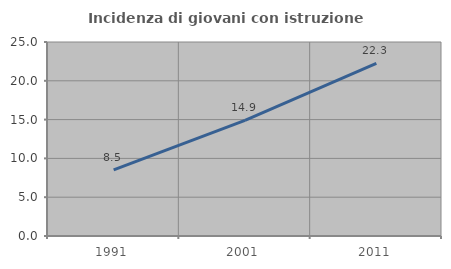
| Category | Incidenza di giovani con istruzione universitaria |
|---|---|
| 1991.0 | 8.524 |
| 2001.0 | 14.888 |
| 2011.0 | 22.252 |